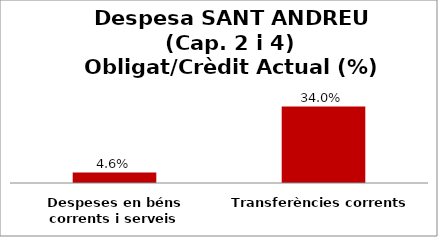
| Category | Series 0 |
|---|---|
| Despeses en béns corrents i serveis | 0.046 |
| Transferències corrents | 0.34 |